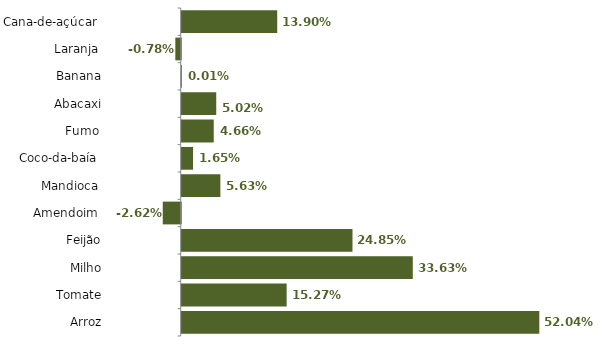
| Category | Series 0 |
|---|---|
| Cana-de-açúcar  | 0.139 |
| Laranja  | -0.008 |
| Banana | 0 |
| Abacaxi | 0.05 |
| Fumo  | 0.047 |
| Coco-da-baía  | 0.017 |
| Mandioca  | 0.056 |
| Amendoim  | -0.026 |
| Feijão | 0.249 |
| Milho | 0.336 |
| Tomate | 0.153 |
| Arroz | 0.52 |